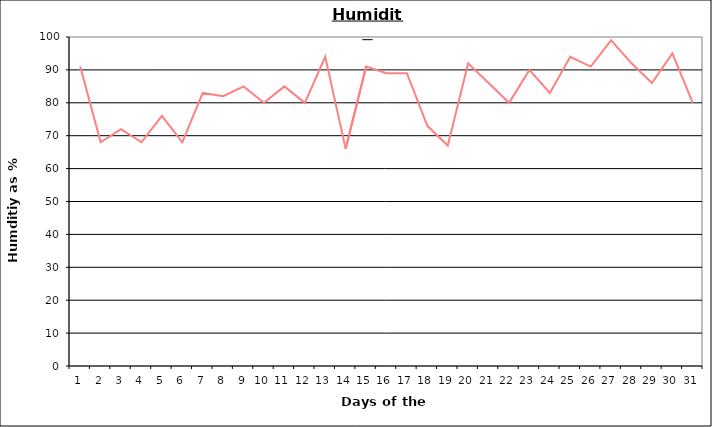
| Category | Series 0 |
|---|---|
| 0 | 91 |
| 1 | 68 |
| 2 | 72 |
| 3 | 68 |
| 4 | 76 |
| 5 | 68 |
| 6 | 83 |
| 7 | 82 |
| 8 | 85 |
| 9 | 80 |
| 10 | 85 |
| 11 | 80 |
| 12 | 94 |
| 13 | 66 |
| 14 | 91 |
| 15 | 89 |
| 16 | 89 |
| 17 | 73 |
| 18 | 67 |
| 19 | 92 |
| 20 | 86 |
| 21 | 80 |
| 22 | 90 |
| 23 | 83 |
| 24 | 94 |
| 25 | 91 |
| 26 | 99 |
| 27 | 92 |
| 28 | 86 |
| 29 | 95 |
| 30 | 80 |